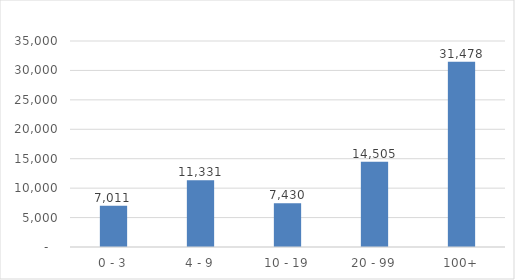
| Category |  Employees |
|---|---|
| 0 - 3 | 7011 |
| 4 - 9 | 11330.6 |
| 10 - 19 | 7429.7 |
| 20 - 99 | 14505.1 |
| 100+ | 31478 |